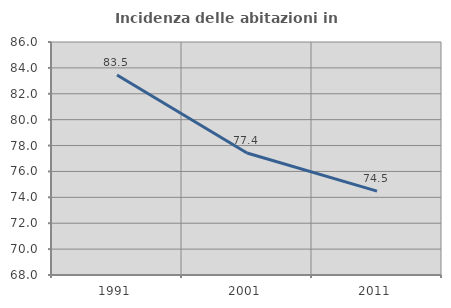
| Category | Incidenza delle abitazioni in proprietà  |
|---|---|
| 1991.0 | 83.451 |
| 2001.0 | 77.423 |
| 2011.0 | 74.475 |